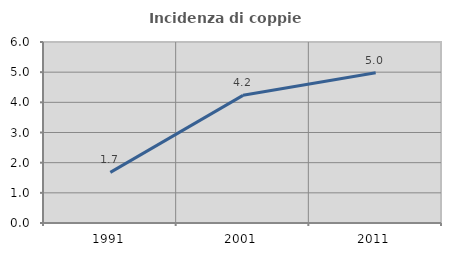
| Category | Incidenza di coppie miste |
|---|---|
| 1991.0 | 1.68 |
| 2001.0 | 4.232 |
| 2011.0 | 4.984 |